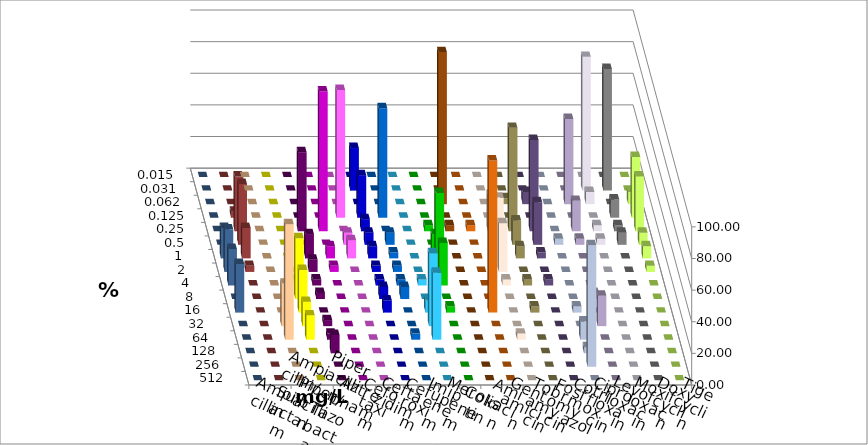
| Category | Ampicillin | Ampicillin/ Sulbactam | Piperacillin | Piperacillin/ Tazobactam | Aztreonam | Cefotaxim | Ceftazidim | Cefuroxim | Imipenem | Meropenem | Colistin | Amikacin | Gentamicin | Tobramycin | Fosfomycin | Cotrimoxazol | Ciprofloxacin | Levofloxacin | Moxifloxacin | Doxycyclin | Tigecyclin |
|---|---|---|---|---|---|---|---|---|---|---|---|---|---|---|---|---|---|---|---|---|---|
| 0.015 | 0 | 0 | 0 | 0 | 0 | 0 | 0 | 0 | 0 | 0 | 0 | 0 | 0 | 0 | 0 | 0 | 0 | 0 | 0 | 0 | 0 |
| 0.031 | 0 | 0 | 0 | 0 | 0 | 26.923 | 0 | 0 | 0 | 0 | 0 | 0 | 0 | 0 | 0 | 0 | 84.615 | 76.923 | 0 | 0 | 0 |
| 0.062 | 0 | 0 | 0 | 0 | 0 | 0 | 0 | 0 | 0 | 96.154 | 0 | 0 | 3.846 | 7.692 | 0 | 53.846 | 7.692 | 0 | 7.692 | 0 | 0 |
| 0.125 | 0 | 0 | 0 | 0 | 80.769 | 26.923 | 69.231 | 0 | 0 | 0 | 0 | 0 | 0 | 0 | 0 | 0 | 0 | 11.538 | 38.462 | 0 | 3.846 |
| 0.25 | 0 | 0 | 50 | 88.462 | 0 | 7.692 | 0 | 0 | 3.846 | 3.846 | 3.846 | 23.077 | 65.385 | 57.692 | 0 | 19.231 | 3.846 | 3.846 | 34.615 | 0 | 34.615 |
| 0.5 | 0 | 0 | 0 | 0 | 7.692 | 7.692 | 7.692 | 0 | 0 | 0 | 0 | 0 | 15.385 | 26.923 | 3.846 | 3.846 | 3.846 | 7.692 | 7.692 | 0 | 38.462 |
| 1.0 | 0 | 0 | 15.385 | 7.692 | 11.538 | 7.692 | 3.846 | 0 | 15.385 | 0 | 0 | 38.462 | 7.692 | 3.846 | 0 | 0 | 0 | 0 | 7.692 | 19.231 | 19.231 |
| 2.0 | 0 | 0 | 7.692 | 3.846 | 0 | 3.846 | 3.846 | 0 | 50 | 0 | 0 | 30.769 | 0 | 0 | 0 | 0 | 0 | 0 | 3.846 | 26.923 | 3.846 |
| 4.0 | 0 | 3.846 | 3.846 | 0 | 0 | 3.846 | 3.846 | 3.846 | 26.923 | 0 | 0 | 3.846 | 3.846 | 3.846 | 0 | 0 | 0 | 0 | 0 | 23.077 | 0 |
| 8.0 | 0 | 38.462 | 3.846 | 0 | 0 | 7.692 | 7.692 | 0 | 0 | 0 | 0 | 0 | 0 | 0 | 0 | 3.846 | 0 | 0 | 0 | 0 | 0 |
| 16.0 | 0 | 26.923 | 0 | 0 | 0 | 7.692 | 0 | 7.692 | 3.846 | 0 | 96.154 | 0 | 3.846 | 0 | 3.846 | 0 | 0 | 0 | 0 | 30.769 | 0 |
| 32.0 | 26.923 | 15.385 | 3.846 | 0 | 0 | 0 | 0 | 46.154 | 0 | 0 | 0 | 0 | 0 | 0 | 0 | 19.231 | 0 | 0 | 0 | 0 | 0 |
| 64.0 | 73.077 | 15.385 | 3.846 | 0 | 0 | 0 | 3.846 | 42.308 | 0 | 0 | 0 | 3.846 | 0 | 0 | 11.538 | 0 | 0 | 0 | 0 | 0 | 0 |
| 128.0 | 0 | 0 | 11.538 | 0 | 0 | 0 | 0 | 0 | 0 | 0 | 0 | 0 | 0 | 0 | 3.846 | 0 | 0 | 0 | 0 | 0 | 0 |
| 256.0 | 0 | 0 | 0 | 0 | 0 | 0 | 0 | 0 | 0 | 0 | 0 | 0 | 0 | 0 | 76.923 | 0 | 0 | 0 | 0 | 0 | 0 |
| 512.0 | 0 | 0 | 0 | 0 | 0 | 0 | 0 | 0 | 0 | 0 | 0 | 0 | 0 | 0 | 0 | 0 | 0 | 0 | 0 | 0 | 0 |